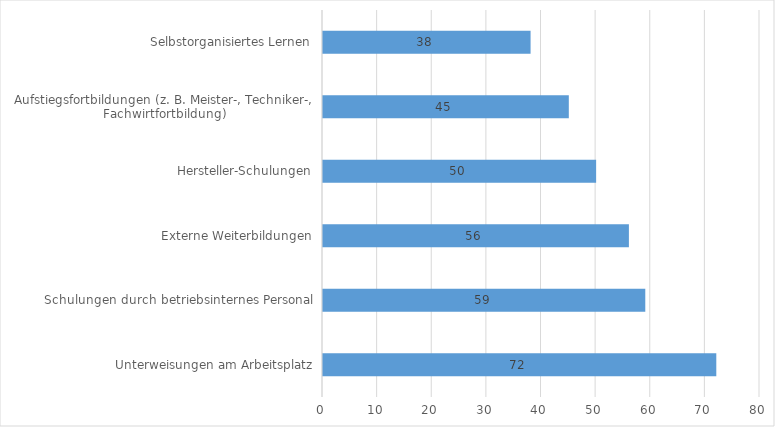
| Category | Series 0 |
|---|---|
| Unterweisungen am Arbeitsplatz | 72 |
| Schulungen durch betriebsinternes Personal | 59 |
| Externe Weiterbildungen | 56 |
| Hersteller-Schulungen | 50 |
| Aufstiegsfortbildungen (z. B. Meister-, Techniker-, Fachwirtfortbildung) | 45 |
| Selbstorganisiertes Lernen | 38 |